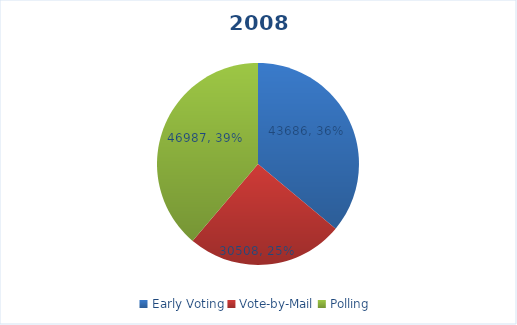
| Category | Series 0 |
|---|---|
| Early Voting | 43686 |
| Vote-by-Mail | 30508 |
| Polling | 46987 |